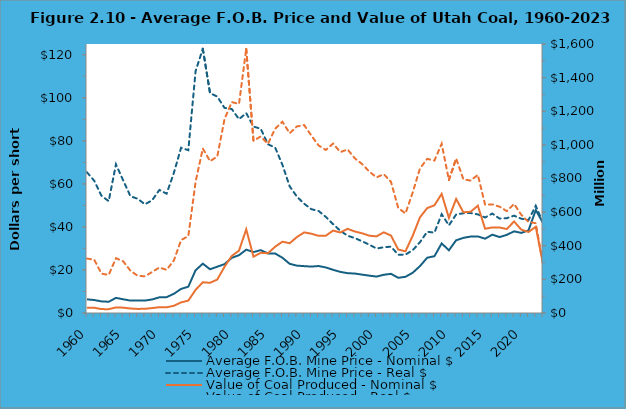
| Category | Average F.O.B. Mine Price - Nominal $ | Average F.O.B. Mine Price - Real $ |
|---|---|---|
| 1960 | 6.35 | 65.367 |
| 1961 | 6.03 | 61.45 |
| 1962 | 5.4 | 54.483 |
| 1963 | 5.22 | 51.979 |
| 1964 | 7.03 | 69.098 |
| 1965 | 6.37 | 61.617 |
| 1966 | 5.77 | 54.263 |
| 1967 | 5.82 | 53.095 |
| 1968 | 5.77 | 50.521 |
| 1969 | 6.31 | 52.389 |
| 1970 | 7.28 | 57.171 |
| 1971 | 7.37 | 55.448 |
| 1972 | 8.93 | 65.095 |
| 1973 | 11.19 | 76.793 |
| 1974 | 12.24 | 75.65 |
| 1975 | 19.84 | 112.366 |
| 1976 | 22.93 | 122.791 |
| 1977 | 20.32 | 102.171 |
| 1978 | 21.52 | 100.57 |
| 1979 | 22.71 | 95.314 |
| 1980 | 25.63 | 94.776 |
| 1981 | 26.87 | 90.07 |
| 1982 | 29.42 | 92.895 |
| 1983 | 28.32 | 86.638 |
| 1984 | 29.2 | 85.633 |
| 1985 | 27.69 | 78.413 |
| 1986 | 27.64 | 76.843 |
| 1987 | 25.67 | 68.853 |
| 1988 | 22.85 | 58.854 |
| 1989 | 22.01 | 54.085 |
| 1990 | 21.78 | 50.776 |
| 1991 | 21.56 | 48.233 |
| 1992 | 21.83 | 47.41 |
| 1993 | 21.17 | 44.64 |
| 1994 | 20.07 | 41.264 |
| 1995 | 19.11 | 38.208 |
| 1996 | 18.5 | 35.927 |
| 1997 | 18.34 | 34.818 |
| 1998 | 17.83 | 33.33 |
| 1999 | 17.36 | 31.75 |
| 2000 | 16.93 | 29.957 |
| 2001 | 17.76 | 30.556 |
| 2002 | 18.2 | 30.826 |
| 2003 | 16.36 | 27.092 |
| 2004 | 16.82 | 27.131 |
| 2005 | 18.71 | 29.191 |
| 2006 | 21.77 | 32.904 |
| 2007 | 25.69 | 37.753 |
| 2008 | 26.39 | 37.348 |
| 2009 | 32.32 | 45.903 |
| 2010 | 29.15 | 40.733 |
| 2011 | 33.8 | 45.785 |
| 2012 | 34.92 | 46.343 |
| 2013 | 35.52 | 46.459 |
| 2014 | 35.59 | 45.808 |
| 2015 | 34.53 | 44.391 |
| 2016 | 36.4 | 46.212 |
| 2017 | 35.28 | 43.856 |
| 2018 | 36.31 | 44.06 |
| 2019 | 37.95 | 45.23 |
| 2020 | 37.22 | 43.82 |
| 2021 | 38.41 | 43.191 |
| 2022 | 47.85 | 49.82 |
| 2023* | 41.85 | 41.85 |